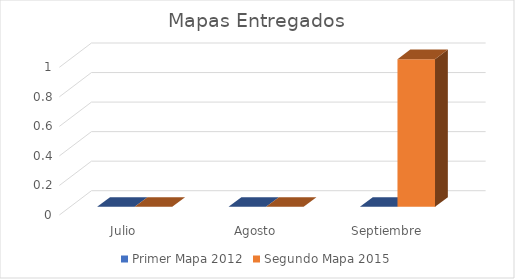
| Category | Primer Mapa 2012 | Segundo Mapa 2015 |
|---|---|---|
| Julio | 0 | 0 |
| Agosto | 0 | 0 |
| Septiembre | 0 | 1 |